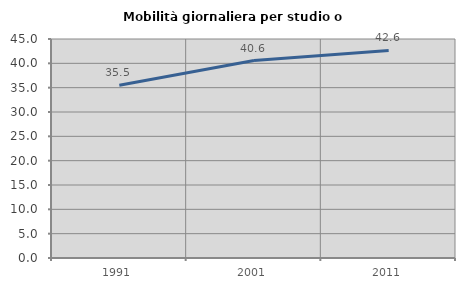
| Category | Mobilità giornaliera per studio o lavoro |
|---|---|
| 1991.0 | 35.488 |
| 2001.0 | 40.572 |
| 2011.0 | 42.64 |